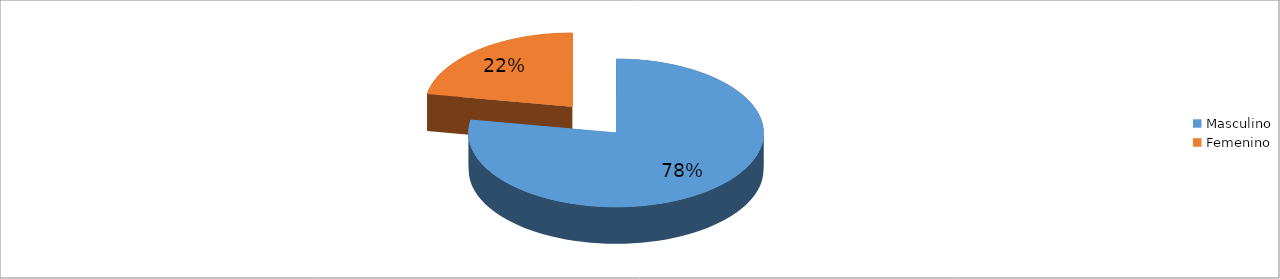
| Category | Series 0 |
|---|---|
| Masculino | 0.778 |
| Femenino | 0.222 |